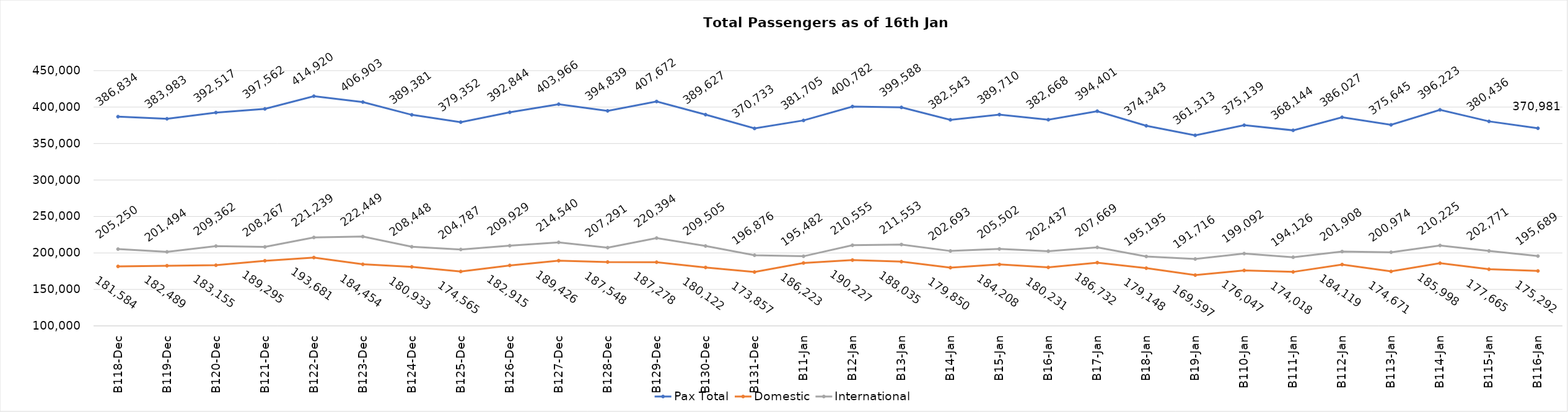
| Category | Pax Total | Domestic | International |
|---|---|---|---|
| 2023-12-18 | 386834 | 181584 | 205250 |
| 2023-12-19 | 383983 | 182489 | 201494 |
| 2023-12-20 | 392517 | 183155 | 209362 |
| 2023-12-21 | 397562 | 189295 | 208267 |
| 2023-12-22 | 414920 | 193681 | 221239 |
| 2023-12-23 | 406903 | 184454 | 222449 |
| 2023-12-24 | 389381 | 180933 | 208448 |
| 2023-12-25 | 379352 | 174565 | 204787 |
| 2023-12-26 | 392844 | 182915 | 209929 |
| 2023-12-27 | 403966 | 189426 | 214540 |
| 2023-12-28 | 394839 | 187548 | 207291 |
| 2023-12-29 | 407672 | 187278 | 220394 |
| 2023-12-30 | 389627 | 180122 | 209505 |
| 2023-12-31 | 370733 | 173857 | 196876 |
| 2024-01-01 | 381705 | 186223 | 195482 |
| 2024-01-02 | 400782 | 190227 | 210555 |
| 2024-01-03 | 399588 | 188035 | 211553 |
| 2024-01-04 | 382543 | 179850 | 202693 |
| 2024-01-05 | 389710 | 184208 | 205502 |
| 2024-01-06 | 382668 | 180231 | 202437 |
| 2024-01-07 | 394401 | 186732 | 207669 |
| 2024-01-08 | 374343 | 179148 | 195195 |
| 2024-01-09 | 361313 | 169597 | 191716 |
| 2024-01-10 | 375139 | 176047 | 199092 |
| 2024-01-11 | 368144 | 174018 | 194126 |
| 2024-01-12 | 386027 | 184119 | 201908 |
| 2024-01-13 | 375645 | 174671 | 200974 |
| 2024-01-14 | 396223 | 185998 | 210225 |
| 2024-01-15 | 380436 | 177665 | 202771 |
| 2024-01-16 | 370981 | 175292 | 195689 |